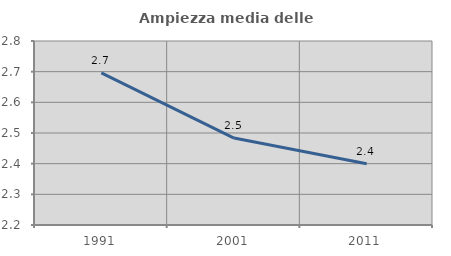
| Category | Ampiezza media delle famiglie |
|---|---|
| 1991.0 | 2.696 |
| 2001.0 | 2.484 |
| 2011.0 | 2.4 |